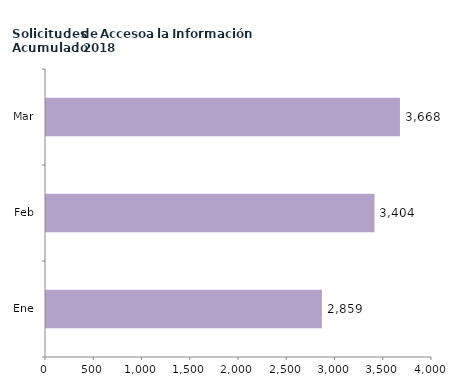
| Category | Series 0 |
|---|---|
| Ene | 2859 |
| Feb | 3404 |
| Mar | 3668 |